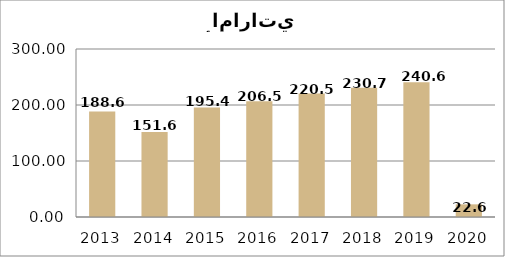
| Category | Series 1 |
|---|---|
| 2013.0 | 188.6 |
| 2014.0 | 151.6 |
| 2015.0 | 195.4 |
| 2016.0 | 206.5 |
| 2017.0 | 220.5 |
| 2018.0 | 230.7 |
| 2019.0 | 240.6 |
| 2020.0 | 22.6 |